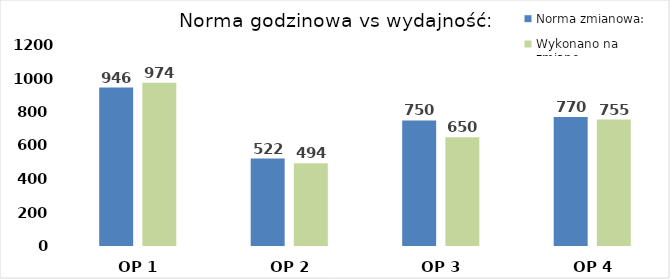
| Category | Norma zmianowa: | Wykonano na zmianę: |
|---|---|---|
| OP 1 | 946 | 974.25 |
| OP 2 | 522 | 494.25 |
| OP 3 | 750 | 649.5 |
| OP 4 | 770 | 754.5 |